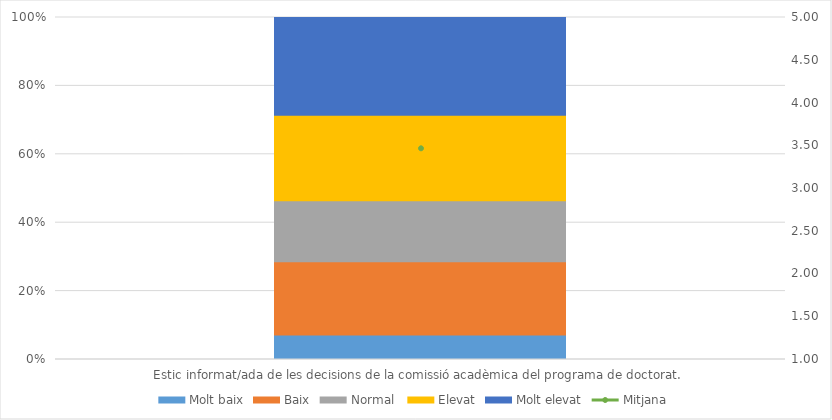
| Category | Molt baix | Baix | Normal  | Elevat | Molt elevat |
|---|---|---|---|---|---|
| Estic informat/ada de les decisions de la comissió acadèmica del programa de doctorat. | 2 | 6 | 5 | 7 | 8 |